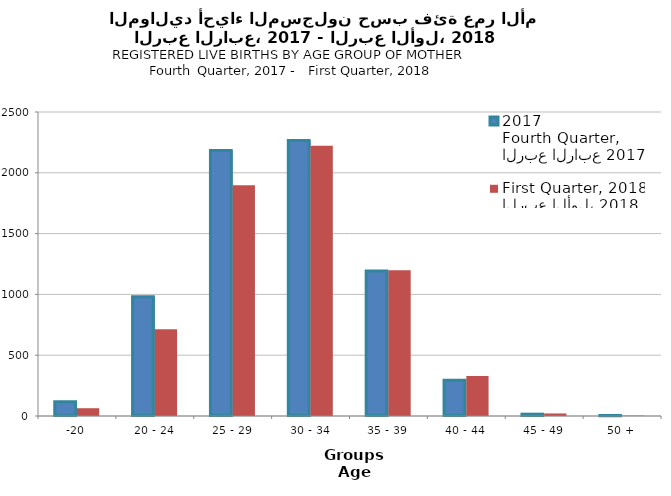
| Category | الربع الرابع 2017
Fourth Quarter, 2017 | الربع الأول، 2018
First Quarter, 2018 |
|---|---|---|
| -20 | 118 | 64 |
| 20 - 24 | 981 | 713 |
| 25 - 29 | 2183 | 1898 |
| 30 - 34 | 2266 | 2222 |
| 35 - 39 | 1193 | 1198 |
| 40 - 44 | 294 | 329 |
| 45 - 49 | 15 | 21 |
| 50 + | 2 | 3 |